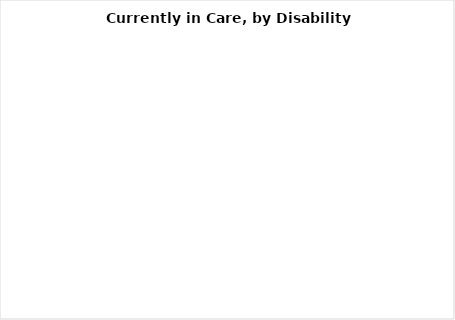
| Category | Series 0 |
|---|---|
| Disabled  | 0 |
| Not Disabled | 0 |